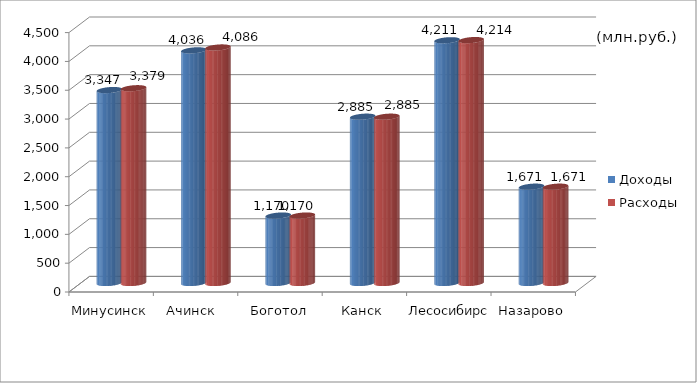
| Category | Доходы | Расходы |
|---|---|---|
| Минусинск | 3347 | 3379 |
| Ачинск  | 4036 | 4086 |
| Боготол | 1170 | 1170 |
| Канск | 2885 | 2885 |
| Лесосибирск | 4211 | 4214 |
| Назарово | 1671 | 1671 |